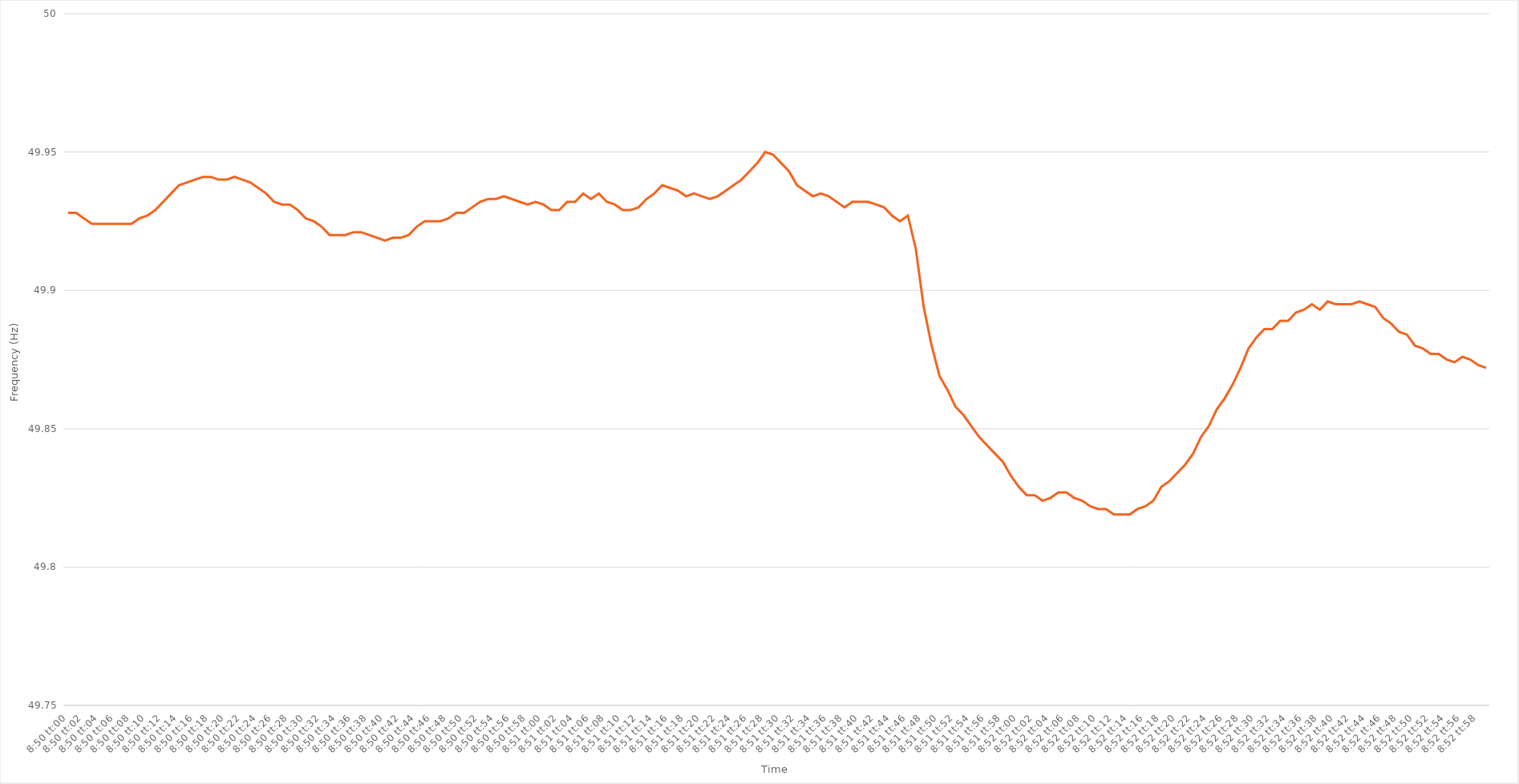
| Category | Series 0 |
|---|---|
| 0.3680555555555556 | 49.928 |
| 0.3680671296296296 | 49.928 |
| 0.3680787037037037 | 49.926 |
| 0.36809027777777775 | 49.924 |
| 0.3681018518518519 | 49.924 |
| 0.36811342592592594 | 49.924 |
| 0.36812500000000004 | 49.924 |
| 0.3681365740740741 | 49.924 |
| 0.3681481481481481 | 49.924 |
| 0.3681597222222222 | 49.926 |
| 0.36817129629629625 | 49.927 |
| 0.3681828703703704 | 49.929 |
| 0.36819444444444444 | 49.932 |
| 0.36820601851851853 | 49.935 |
| 0.36821759259259257 | 49.938 |
| 0.36822916666666666 | 49.939 |
| 0.3682407407407407 | 49.94 |
| 0.36825231481481485 | 49.941 |
| 0.3682638888888889 | 49.941 |
| 0.368275462962963 | 49.94 |
| 0.368287037037037 | 49.94 |
| 0.3682986111111111 | 49.941 |
| 0.36831018518518516 | 49.94 |
| 0.3683217592592593 | 49.939 |
| 0.36833333333333335 | 49.937 |
| 0.36834490740740744 | 49.935 |
| 0.3683564814814815 | 49.932 |
| 0.3683680555555556 | 49.931 |
| 0.3683796296296296 | 49.931 |
| 0.36839120370370365 | 49.929 |
| 0.3684027777777778 | 49.926 |
| 0.36841435185185184 | 49.925 |
| 0.36842592592592593 | 49.923 |
| 0.3684375 | 49.92 |
| 0.36844907407407407 | 49.92 |
| 0.3684606481481481 | 49.92 |
| 0.36847222222222226 | 49.921 |
| 0.3684837962962963 | 49.921 |
| 0.3684953703703704 | 49.92 |
| 0.36850694444444443 | 49.919 |
| 0.3685185185185185 | 49.918 |
| 0.36853009259259256 | 49.919 |
| 0.3685416666666667 | 49.919 |
| 0.36855324074074075 | 49.92 |
| 0.36856481481481485 | 49.923 |
| 0.3685763888888889 | 49.925 |
| 0.368587962962963 | 49.925 |
| 0.368599537037037 | 49.925 |
| 0.36861111111111106 | 49.926 |
| 0.3686226851851852 | 49.928 |
| 0.36863425925925924 | 49.928 |
| 0.36864583333333334 | 49.93 |
| 0.3686574074074074 | 49.932 |
| 0.3686689814814815 | 49.933 |
| 0.3686805555555555 | 49.933 |
| 0.36869212962962966 | 49.934 |
| 0.3687037037037037 | 49.933 |
| 0.3687152777777778 | 49.932 |
| 0.36872685185185183 | 49.931 |
| 0.36873842592592593 | 49.932 |
| 0.36874999999999997 | 49.931 |
| 0.3687615740740741 | 49.929 |
| 0.36877314814814816 | 49.929 |
| 0.36878472222222225 | 49.932 |
| 0.3687962962962963 | 49.932 |
| 0.3688078703703704 | 49.935 |
| 0.3688194444444444 | 49.933 |
| 0.36883101851851857 | 49.935 |
| 0.3688425925925926 | 49.932 |
| 0.36885416666666665 | 49.931 |
| 0.36886574074074074 | 49.929 |
| 0.3688773148148148 | 49.929 |
| 0.3688888888888889 | 49.93 |
| 0.3689004629629629 | 49.933 |
| 0.36891203703703707 | 49.935 |
| 0.3689236111111111 | 49.938 |
| 0.3689351851851852 | 49.937 |
| 0.36894675925925924 | 49.936 |
| 0.36895833333333333 | 49.934 |
| 0.36896990740740737 | 49.935 |
| 0.3689814814814815 | 49.934 |
| 0.36899305555555556 | 49.933 |
| 0.36900462962962965 | 49.934 |
| 0.3690162037037037 | 49.936 |
| 0.3690277777777778 | 49.938 |
| 0.3690393518518518 | 49.94 |
| 0.369050925925926 | 49.943 |
| 0.3690625 | 49.946 |
| 0.3690740740740741 | 49.95 |
| 0.36908564814814815 | 49.949 |
| 0.3690972222222222 | 49.946 |
| 0.3691087962962963 | 49.943 |
| 0.3691203703703703 | 49.938 |
| 0.36913194444444447 | 49.936 |
| 0.3691435185185185 | 49.934 |
| 0.3691550925925926 | 49.935 |
| 0.36916666666666664 | 49.934 |
| 0.36917824074074074 | 49.932 |
| 0.3691898148148148 | 49.93 |
| 0.3692013888888889 | 49.932 |
| 0.36921296296296297 | 49.932 |
| 0.36922453703703706 | 49.932 |
| 0.3692361111111111 | 49.931 |
| 0.3692476851851852 | 49.93 |
| 0.36925925925925923 | 49.927 |
| 0.3692708333333334 | 49.925 |
| 0.3692824074074074 | 49.927 |
| 0.3692939814814815 | 49.915 |
| 0.36930555555555555 | 49.894 |
| 0.36931712962962965 | 49.88 |
| 0.3693287037037037 | 49.869 |
| 0.3693402777777777 | 49.864 |
| 0.3693518518518519 | 49.858 |
| 0.3693634259259259 | 49.855 |
| 0.369375 | 49.851 |
| 0.36938657407407405 | 49.847 |
| 0.36939814814814814 | 49.844 |
| 0.3694097222222222 | 49.841 |
| 0.36942129629629633 | 49.838 |
| 0.36943287037037037 | 49.833 |
| 0.36944444444444446 | 49.829 |
| 0.3694560185185185 | 49.826 |
| 0.3694675925925926 | 49.826 |
| 0.36947916666666664 | 49.824 |
| 0.3694907407407408 | 49.825 |
| 0.3695023148148148 | 49.827 |
| 0.3695138888888889 | 49.827 |
| 0.36952546296296296 | 49.825 |
| 0.36953703703703705 | 49.824 |
| 0.3695486111111111 | 49.822 |
| 0.36956018518518513 | 49.821 |
| 0.3695717592592593 | 49.821 |
| 0.3695833333333333 | 49.819 |
| 0.3695949074074074 | 49.819 |
| 0.36960648148148145 | 49.819 |
| 0.36961805555555555 | 49.821 |
| 0.3696296296296296 | 49.822 |
| 0.36964120370370374 | 49.824 |
| 0.3696527777777778 | 49.829 |
| 0.36966435185185187 | 49.831 |
| 0.3696759259259259 | 49.834 |
| 0.3696875 | 49.837 |
| 0.36969907407407404 | 49.841 |
| 0.3697106481481482 | 49.847 |
| 0.36972222222222223 | 49.851 |
| 0.3697337962962963 | 49.857 |
| 0.36974537037037036 | 49.861 |
| 0.36975694444444446 | 49.866 |
| 0.3697685185185185 | 49.872 |
| 0.36978009259259265 | 49.879 |
| 0.3697916666666667 | 49.883 |
| 0.3698032407407407 | 49.886 |
| 0.3698148148148148 | 49.886 |
| 0.36982638888888886 | 49.889 |
| 0.36983796296296295 | 49.889 |
| 0.369849537037037 | 49.892 |
| 0.36986111111111114 | 49.893 |
| 0.3698726851851852 | 49.895 |
| 0.3698842592592593 | 49.893 |
| 0.3698958333333333 | 49.896 |
| 0.3699074074074074 | 49.895 |
| 0.36991898148148145 | 49.895 |
| 0.3699305555555556 | 49.895 |
| 0.36994212962962963 | 49.896 |
| 0.36995370370370373 | 49.895 |
| 0.36996527777777777 | 49.894 |
| 0.36997685185185186 | 49.89 |
| 0.3699884259259259 | 49.888 |
| 0.37000000000000005 | 49.885 |
| 0.3700115740740741 | 49.884 |
| 0.3700231481481482 | 49.88 |
| 0.3700347222222222 | 49.879 |
| 0.37004629629629626 | 49.877 |
| 0.37005787037037036 | 49.877 |
| 0.3700694444444444 | 49.875 |
| 0.37008101851851855 | 49.874 |
| 0.3700925925925926 | 49.876 |
| 0.3701041666666667 | 49.875 |
| 0.3701157407407407 | 49.873 |
| 0.3701273148148148 | 49.872 |